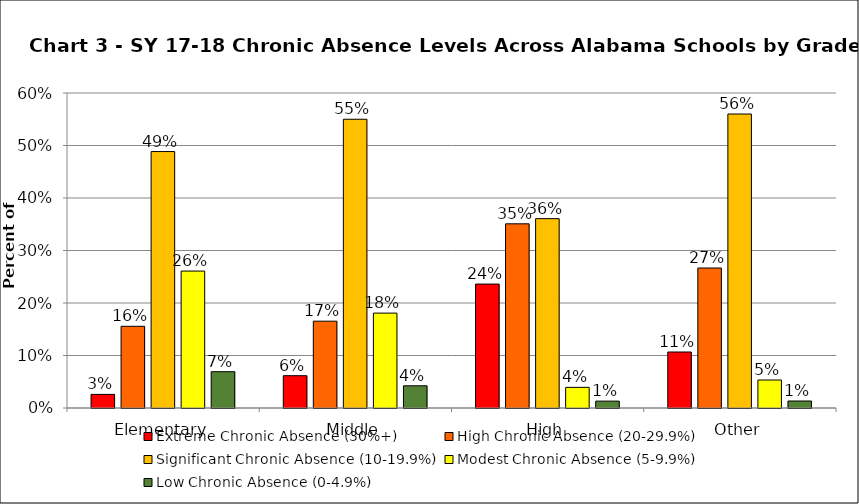
| Category | Extreme Chronic Absence (30%+) | High Chronic Absence (20-29.9%) | Significant Chronic Absence (10-19.9%) | Modest Chronic Absence (5-9.9%) | Low Chronic Absence (0-4.9%) |
|---|---|---|---|---|---|
| 0 | 0.026 | 0.156 | 0.488 | 0.261 | 0.069 |
| 1 | 0.062 | 0.165 | 0.55 | 0.181 | 0.042 |
| 2 | 0.236 | 0.351 | 0.361 | 0.039 | 0.013 |
| 3 | 0.107 | 0.267 | 0.56 | 0.053 | 0.013 |